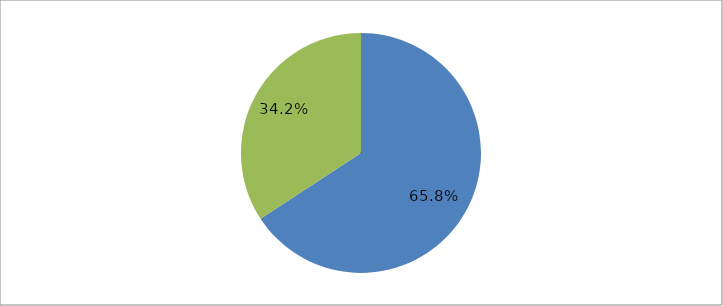
| Category | Series 0 |
|---|---|
| 0 | 0.658 |
| 1 | 0.342 |